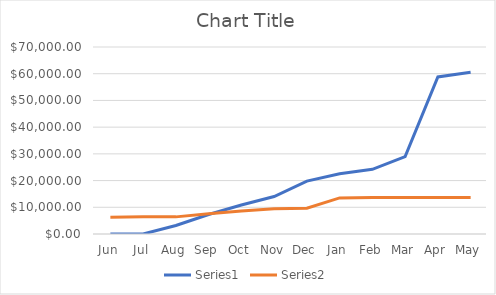
| Category | Series 0 | Series 1 |
|---|---|---|
| Jun | 0 | 6294.15 |
| Jul | 0 | 6411.55 |
| Aug | 3198.12 | 6411.55 |
| Sep | 7283.93 | 7543.87 |
| Oct | 10829.56 | 8614.2 |
| Nov | 14026.99 | 9468.4 |
| Dec | 19799.86 | 9632.39 |
| Jan | 22545.73 | 13520.77 |
| Feb | 24224.95 | 13676.98 |
| Mar | 28964.18 | 13676.98 |
| Apr | 58789.2 | 13676.98 |
| May | 60539.07 | 13676.98 |